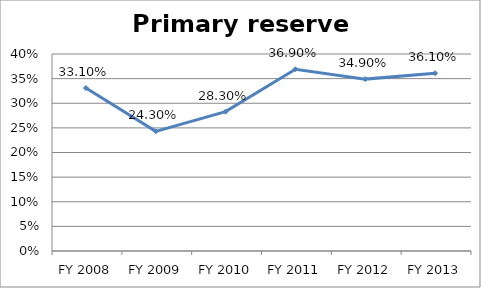
| Category | Primary reserve ratio |
|---|---|
| FY 2013 | 0.361 |
| FY 2012 | 0.349 |
| FY 2011 | 0.369 |
| FY 2010 | 0.283 |
| FY 2009 | 0.243 |
| FY 2008 | 0.331 |